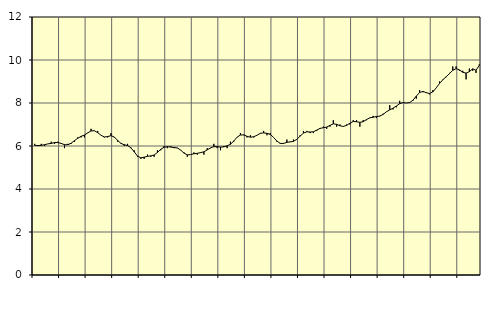
| Category | Piggar | Offentlig förvaltning m.m., SNI 84, 99 |
|---|---|---|
| nan | 6.1 | 6.03 |
| 87.0 | 6 | 6.02 |
| 87.0 | 6.1 | 6.03 |
| 87.0 | 6 | 6.06 |
| nan | 6.1 | 6.1 |
| 88.0 | 6.2 | 6.12 |
| 88.0 | 6.1 | 6.16 |
| 88.0 | 6.2 | 6.16 |
| nan | 6.1 | 6.12 |
| 89.0 | 5.9 | 6.06 |
| 89.0 | 6.1 | 6.06 |
| 89.0 | 6.1 | 6.13 |
| nan | 6.2 | 6.25 |
| 90.0 | 6.4 | 6.36 |
| 90.0 | 6.4 | 6.45 |
| 90.0 | 6.4 | 6.51 |
| nan | 6.6 | 6.61 |
| 91.0 | 6.8 | 6.7 |
| 91.0 | 6.7 | 6.71 |
| 91.0 | 6.7 | 6.62 |
| nan | 6.5 | 6.5 |
| 92.0 | 6.4 | 6.42 |
| 92.0 | 6.4 | 6.44 |
| 92.0 | 6.6 | 6.48 |
| nan | 6.4 | 6.42 |
| 93.0 | 6.2 | 6.26 |
| 93.0 | 6.1 | 6.12 |
| 93.0 | 6 | 6.06 |
| nan | 6.1 | 6.02 |
| 94.0 | 5.9 | 5.92 |
| 94.0 | 5.8 | 5.73 |
| 94.0 | 5.5 | 5.53 |
| nan | 5.4 | 5.45 |
| 95.0 | 5.4 | 5.48 |
| 95.0 | 5.6 | 5.52 |
| 95.0 | 5.5 | 5.54 |
| nan | 5.5 | 5.58 |
| 96.0 | 5.8 | 5.7 |
| 96.0 | 5.8 | 5.85 |
| 96.0 | 6 | 5.94 |
| nan | 5.9 | 5.97 |
| 97.0 | 6 | 5.95 |
| 97.0 | 5.9 | 5.93 |
| 97.0 | 5.9 | 5.91 |
| nan | 5.8 | 5.81 |
| 98.0 | 5.7 | 5.67 |
| 98.0 | 5.5 | 5.59 |
| 98.0 | 5.6 | 5.6 |
| nan | 5.7 | 5.64 |
| 99.0 | 5.6 | 5.66 |
| 99.0 | 5.7 | 5.69 |
| 99.0 | 5.6 | 5.73 |
| nan | 5.9 | 5.82 |
| 0.0 | 5.9 | 5.91 |
| 0.0 | 6.1 | 5.97 |
| 0.0 | 5.9 | 5.97 |
| nan | 5.8 | 5.95 |
| 1.0 | 6 | 5.96 |
| 1.0 | 5.9 | 6.01 |
| 1.0 | 6.2 | 6.08 |
| nan | 6.2 | 6.23 |
| 2.0 | 6.4 | 6.41 |
| 2.0 | 6.6 | 6.51 |
| 2.0 | 6.5 | 6.52 |
| nan | 6.4 | 6.45 |
| 3.0 | 6.5 | 6.41 |
| 3.0 | 6.4 | 6.43 |
| 3.0 | 6.5 | 6.5 |
| nan | 6.6 | 6.59 |
| 4.0 | 6.7 | 6.61 |
| 4.0 | 6.5 | 6.59 |
| 4.0 | 6.6 | 6.54 |
| nan | 6.4 | 6.4 |
| 5.0 | 6.2 | 6.23 |
| 5.0 | 6.1 | 6.12 |
| 5.0 | 6.1 | 6.12 |
| nan | 6.3 | 6.17 |
| 6.0 | 6.2 | 6.19 |
| 6.0 | 6.3 | 6.22 |
| 6.0 | 6.3 | 6.31 |
| nan | 6.5 | 6.46 |
| 7.0 | 6.7 | 6.6 |
| 7.0 | 6.7 | 6.66 |
| 7.0 | 6.6 | 6.65 |
| nan | 6.6 | 6.66 |
| 8.0 | 6.7 | 6.74 |
| 8.0 | 6.8 | 6.82 |
| 8.0 | 6.9 | 6.85 |
| nan | 6.8 | 6.88 |
| 9.0 | 6.9 | 6.96 |
| 9.0 | 7.2 | 7.03 |
| 9.0 | 6.9 | 7.01 |
| nan | 7 | 6.94 |
| 10.0 | 6.9 | 6.91 |
| 10.0 | 7 | 6.96 |
| 10.0 | 7 | 7.06 |
| nan | 7.2 | 7.14 |
| 11.0 | 7.2 | 7.13 |
| 11.0 | 6.9 | 7.1 |
| 11.0 | 7.2 | 7.13 |
| nan | 7.2 | 7.23 |
| 12.0 | 7.3 | 7.31 |
| 12.0 | 7.4 | 7.34 |
| 12.0 | 7.3 | 7.37 |
| nan | 7.4 | 7.39 |
| 13.0 | 7.5 | 7.47 |
| 13.0 | 7.6 | 7.59 |
| 13.0 | 7.9 | 7.68 |
| nan | 7.7 | 7.76 |
| 14.0 | 7.8 | 7.86 |
| 14.0 | 8.1 | 7.97 |
| 14.0 | 8 | 8.02 |
| nan | 8 | 8 |
| 15.0 | 8 | 8.02 |
| 15.0 | 8.1 | 8.13 |
| 15.0 | 8.2 | 8.32 |
| nan | 8.6 | 8.49 |
| 16.0 | 8.5 | 8.54 |
| 16.0 | 8.5 | 8.48 |
| 16.0 | 8.4 | 8.44 |
| nan | 8.6 | 8.52 |
| 17.0 | 8.7 | 8.7 |
| 17.0 | 9 | 8.91 |
| 17.0 | 9.1 | 9.08 |
| nan | 9.2 | 9.22 |
| 18.0 | 9.4 | 9.37 |
| 18.0 | 9.7 | 9.52 |
| 18.0 | 9.7 | 9.6 |
| nan | 9.5 | 9.54 |
| 19.0 | 9.5 | 9.43 |
| 19.0 | 9.1 | 9.39 |
| 19.0 | 9.6 | 9.46 |
| nan | 9.5 | 9.59 |
| 20.0 | 9.4 | 9.52 |
| 20.0 | 9.8 | 9.76 |